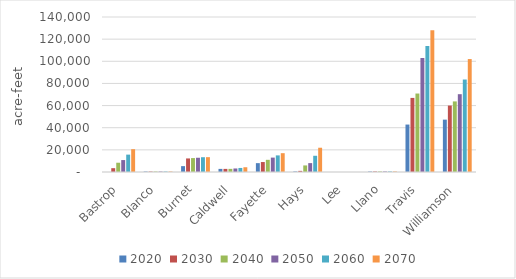
| Category | 2020 | 2030 | 2040 | 2050 | 2060 | 2070 |
|---|---|---|---|---|---|---|
| Bastrop | 0 | 3452 | 8371 | 10778 | 15696 | 20619 |
| Blanco | 425 | 425 | 425 | 425 | 425 | 425 |
| Burnet | 5298 | 12247 | 12571 | 12868 | 13348 | 13402 |
| Caldwell | 2806 | 2810 | 2827 | 3181 | 3652 | 4300 |
| Fayette | 8000 | 9000 | 11000 | 13000 | 15000 | 17000 |
| Hays | 474 | 1021 | 5934 | 8024 | 14659 | 21916 |
| Lee | 0 | 0 | 0 | 0 | 0 | 0 |
| Llano | 425 | 475 | 475 | 475 | 475 | 475 |
| Travis | 42852 | 66914 | 70877 | 102956 | 113822 | 127957 |
| Williamson | 47289 | 60008 | 63759 | 70282 | 83531 | 102014 |